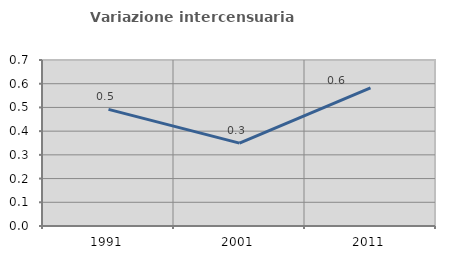
| Category | Variazione intercensuaria annua |
|---|---|
| 1991.0 | 0.492 |
| 2001.0 | 0.349 |
| 2011.0 | 0.582 |